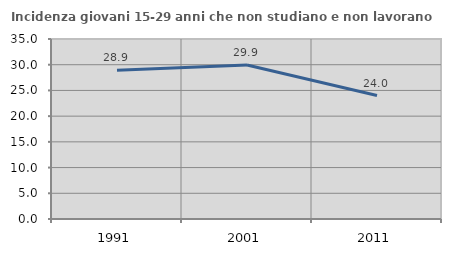
| Category | Incidenza giovani 15-29 anni che non studiano e non lavorano  |
|---|---|
| 1991.0 | 28.918 |
| 2001.0 | 29.941 |
| 2011.0 | 24.009 |